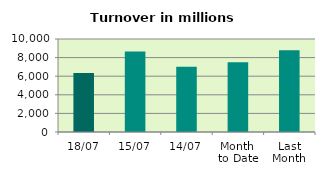
| Category | Series 0 |
|---|---|
| 18/07 | 6354.427 |
| 15/07 | 8659.06 |
| 14/07 | 7024.523 |
| Month 
to Date | 7493.291 |
| Last
Month | 8790.45 |